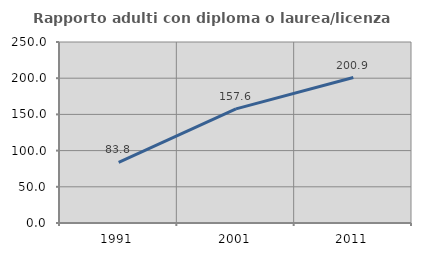
| Category | Rapporto adulti con diploma o laurea/licenza media  |
|---|---|
| 1991.0 | 83.838 |
| 2001.0 | 157.576 |
| 2011.0 | 200.935 |